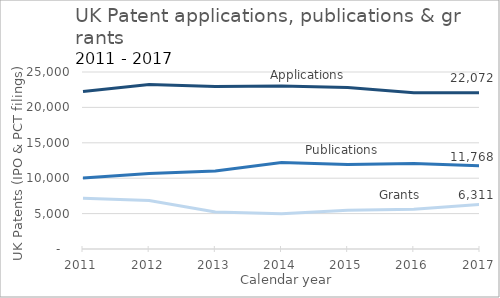
| Category | Applications | Publications | Grants |
|---|---|---|---|
| 2011 | 22256 | 10043 | 7173 |
| 2012 | 23229 | 10653 | 6864 |
| 2013 | 22936 | 11021 | 5235 |
| 2014 | 23040 | 12227 | 4986 |
| 2015 | 22801 | 11939 | 5464 |
| 2016 | 22055 | 12065 | 5602 |
| 2017 | 22072 | 11768 | 6311 |